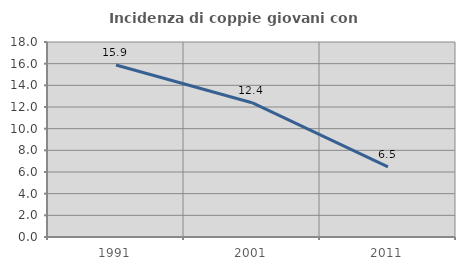
| Category | Incidenza di coppie giovani con figli |
|---|---|
| 1991.0 | 15.875 |
| 2001.0 | 12.399 |
| 2011.0 | 6.464 |